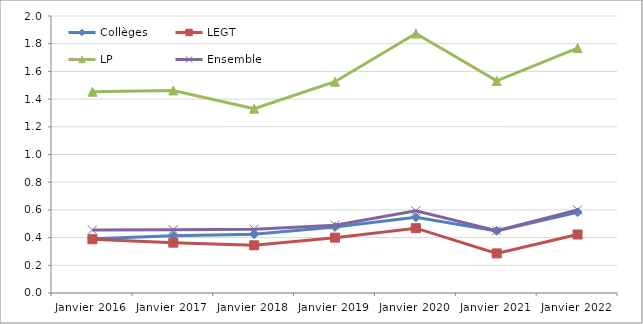
| Category | Collèges | LEGT | LP  | Ensemble |
|---|---|---|---|---|
| Janvier 2016 | 0.392 | 0.388 | 1.453 | 0.455 |
| Janvier 2017 | 0.413 | 0.363 | 1.462 | 0.456 |
| Janvier 2018 | 0.424 | 0.344 | 1.331 | 0.461 |
| Janvier 2019 | 0.477 | 0.4 | 1.526 | 0.49 |
| Janvier 2020 | 0.546 | 0.468 | 1.873 | 0.593 |
| Janvier 2021 | 0.449 | 0.286 | 1.531 | 0.45 |
| Janvier 2022 | 0.583 | 0.422 | 1.769 | 0.6 |